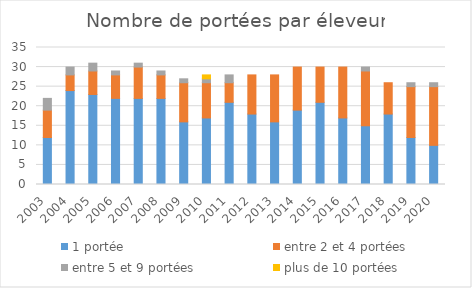
| Category | 1 portée | entre 2 et 4 portées | entre 5 et 9 portées | plus de 10 portées |
|---|---|---|---|---|
| 2003.0 | 12 | 7 | 3 | 0 |
| 2004.0 | 24 | 4 | 2 | 0 |
| 2005.0 | 23 | 6 | 2 | 0 |
| 2006.0 | 22 | 6 | 1 | 0 |
| 2007.0 | 22 | 8 | 1 | 0 |
| 2008.0 | 22 | 6 | 1 | 0 |
| 2009.0 | 16 | 10 | 1 | 0 |
| 2010.0 | 17 | 9 | 1 | 1 |
| 2011.0 | 21 | 5 | 2 | 0 |
| 2012.0 | 18 | 10 | 0 | 0 |
| 2013.0 | 16 | 12 | 0 | 0 |
| 2014.0 | 19 | 11 | 0 | 0 |
| 2015.0 | 21 | 9 | 0 | 0 |
| 2016.0 | 17 | 13 | 0 | 0 |
| 2017.0 | 15 | 14 | 1 | 0 |
| 2018.0 | 18 | 8 | 0 | 0 |
| 2019.0 | 12 | 13 | 1 | 0 |
| 2020.0 | 10 | 15 | 1 | 0 |